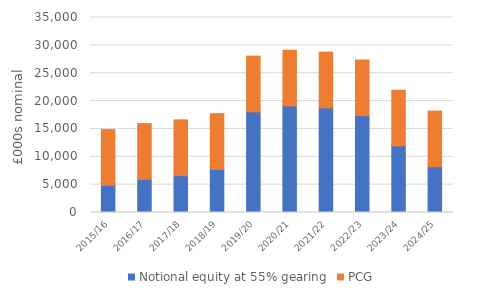
| Category | Notional equity at 55% gearing | PCG |
|---|---|---|
| 2015/16 | 4880.87 | 10000 |
| 2016/17 | 5951.704 | 10000 |
| 2017/18 | 6619.295 | 10000 |
| 2018/19 | 7737.013 | 10000 |
| 2019/20 | 18063.801 | 10000 |
| 2020/21 | 19121.121 | 10000 |
| 2021/22 | 18781.671 | 10000 |
| 2022/23 | 17373.656 | 10000 |
| 2023/24 | 11946.97 | 10000 |
| 2024/25 | 8209.398 | 10000 |